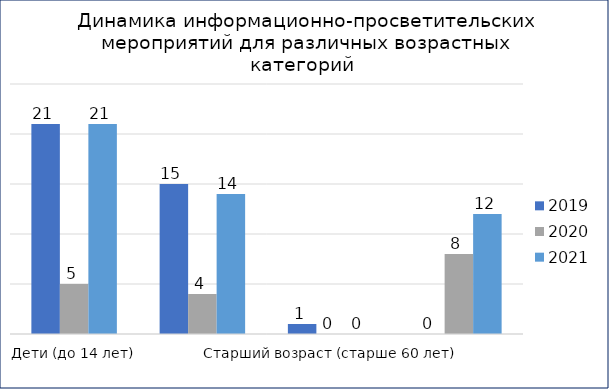
| Category | 2019 | 2020 | 2021 |
|---|---|---|---|
| Дети (до 14 лет) | 21 | 5 | 21 |
| Молодой возраст (14-35 лет) | 15 | 4 | 14 |
| Старший возраст (старше 60 лет) | 1 | 0 | 0 |
| Смешанный возраст (для любого возраста) | 0 | 8 | 12 |